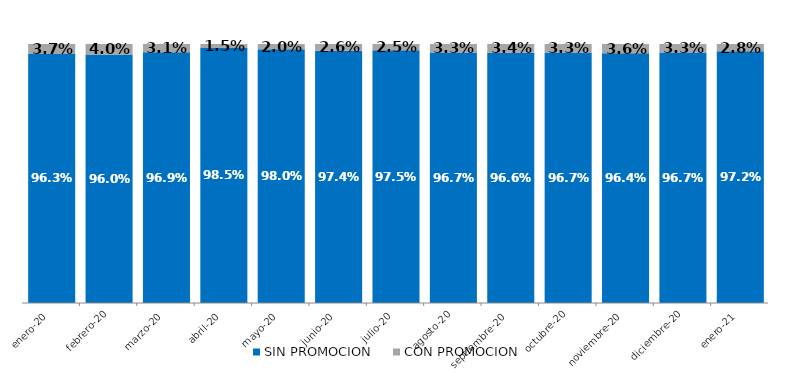
| Category | SIN PROMOCION   | CON PROMOCION   |
|---|---|---|
| 2020-01-01 | 0.963 | 0.037 |
| 2020-02-01 | 0.96 | 0.04 |
| 2020-03-01 | 0.969 | 0.031 |
| 2020-04-01 | 0.985 | 0.015 |
| 2020-05-01 | 0.98 | 0.02 |
| 2020-06-01 | 0.974 | 0.026 |
| 2020-07-01 | 0.975 | 0.025 |
| 2020-08-01 | 0.967 | 0.033 |
| 2020-09-01 | 0.966 | 0.034 |
| 2020-10-01 | 0.967 | 0.033 |
| 2020-11-01 | 0.964 | 0.036 |
| 2020-12-01 | 0.967 | 0.033 |
| 2021-01-01 | 0.972 | 0.028 |